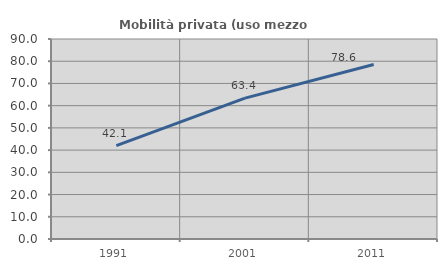
| Category | Mobilità privata (uso mezzo privato) |
|---|---|
| 1991.0 | 42.051 |
| 2001.0 | 63.405 |
| 2011.0 | 78.556 |